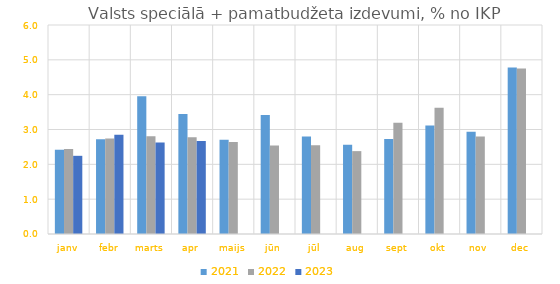
| Category | 2021 | 2022 | 2023 |
|---|---|---|---|
| janv | 2.419 | 2.443 | 2.245 |
| febr | 2.72 | 2.739 | 2.846 |
| marts | 3.957 | 2.805 | 2.63 |
| apr | 3.444 | 2.776 | 2.671 |
| maijs | 2.708 | 2.642 | 0 |
| jūn | 3.414 | 2.544 | 0 |
| jūl | 2.797 | 2.545 | 0 |
| aug | 2.563 | 2.379 | 0 |
| sept | 2.727 | 3.192 | 0 |
| okt | 3.113 | 3.622 | 0 |
| nov | 2.932 | 2.797 | 0 |
| dec | 4.779 | 4.752 | 0 |